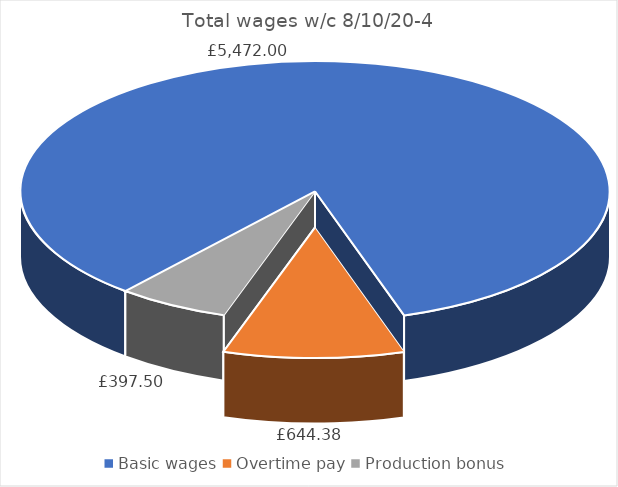
| Category | Series 0 | Series 1 | Series 2 | Series 3 | Series 4 | Series 5 | Series 6 | Series 7 | Series 8 |
|---|---|---|---|---|---|---|---|---|---|
| Basic wages |  |  |  |  |  |  |  |  | 5472 |
| Overtime pay |  |  |  |  |  |  |  |  | 644.375 |
| Production bonus |  |  |  |  |  |  |  |  | 397.5 |